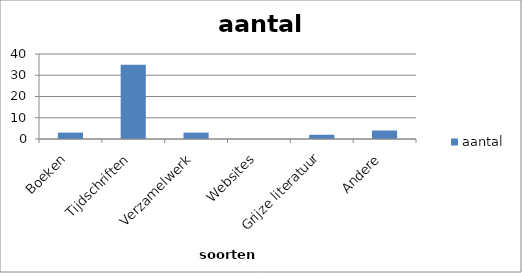
| Category | aantal |
|---|---|
| Boeken | 3 |
| Tijdschriften | 35 |
| Verzamelwerk | 3 |
| Websites | 0 |
| Grijze literatuur | 2 |
| Andere | 4 |